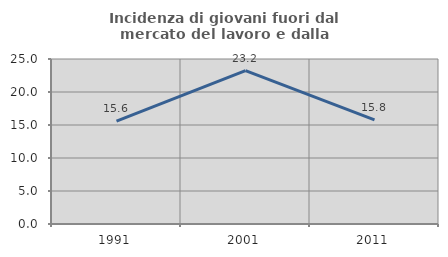
| Category | Incidenza di giovani fuori dal mercato del lavoro e dalla formazione  |
|---|---|
| 1991.0 | 15.581 |
| 2001.0 | 23.244 |
| 2011.0 | 15.775 |